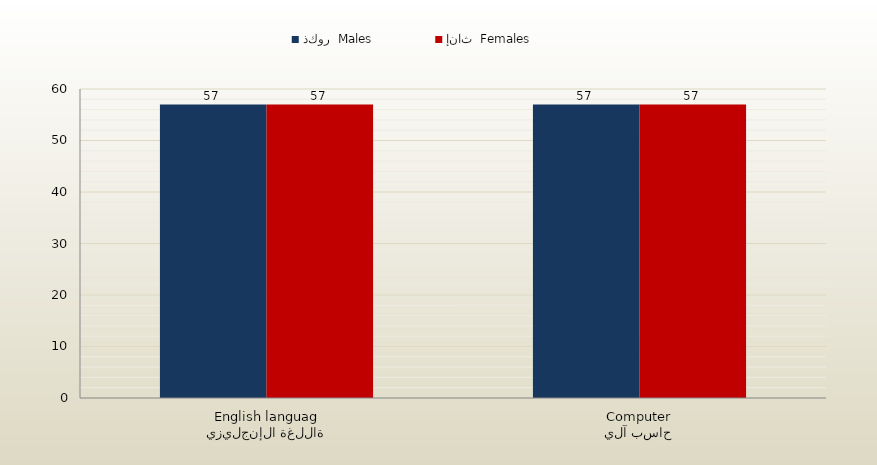
| Category | ذكور  Males | إناث  Females |
|---|---|---|
| اللغة الإنجليزية
English language | 57 | 57 |
| حاسب آلي
Computer | 57 | 57 |